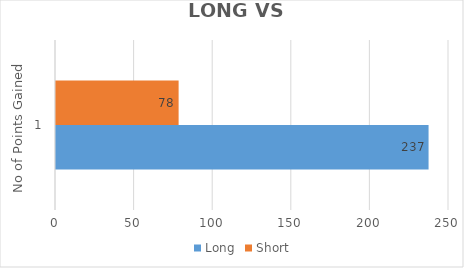
| Category | Long | Short |
|---|---|---|
| 0 | 237 | 78 |